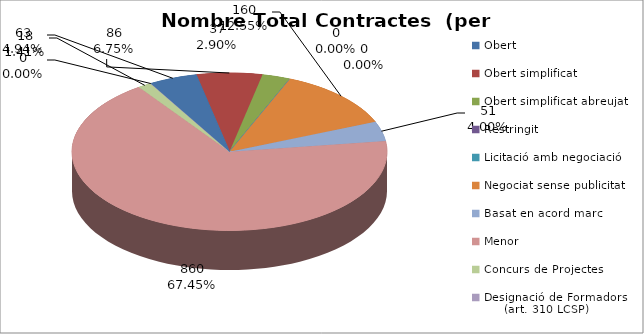
| Category | Nombre Total Contractes |
|---|---|
| Obert | 63 |
| Obert simplificat | 86 |
| Obert simplificat abreujat | 37 |
| Restringit | 0 |
| Licitació amb negociació | 0 |
| Negociat sense publicitat | 160 |
| Basat en acord marc | 51 |
| Menor | 860 |
| Concurs de Projectes | 18 |
| Designació de Formadors
     (art. 310 LCSP) | 0 |